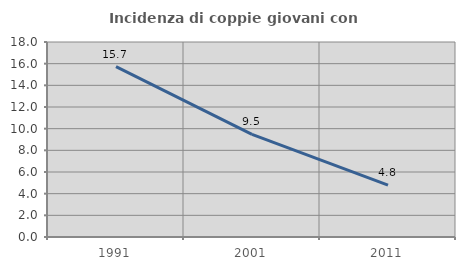
| Category | Incidenza di coppie giovani con figli |
|---|---|
| 1991.0 | 15.733 |
| 2001.0 | 9.471 |
| 2011.0 | 4.795 |